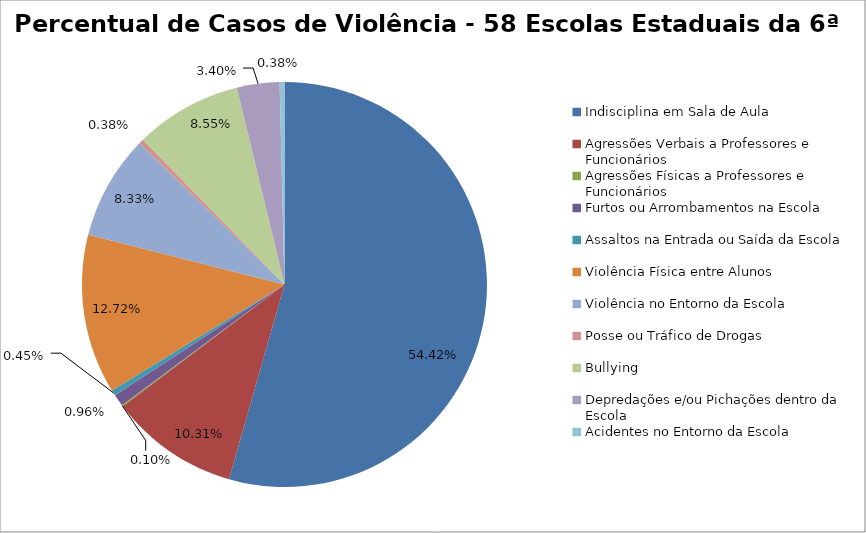
| Category | Percentual |
|---|---|
| Indisciplina em Sala de Aula | 0.544 |
| Agressões Verbais a Professores e Funcionários | 0.103 |
| Agressões Físicas a Professores e Funcionários | 0.001 |
| Furtos ou Arrombamentos na Escola | 0.01 |
| Assaltos na Entrada ou Saída da Escola | 0.004 |
| Violência Física entre Alunos | 0.127 |
| Violência no Entorno da Escola | 0.083 |
| Posse ou Tráfico de Drogas | 0.004 |
| Bullying | 0.086 |
| Depredações e/ou Pichações dentro da Escola | 0.034 |
| Acidentes no Entorno da Escola | 0.004 |